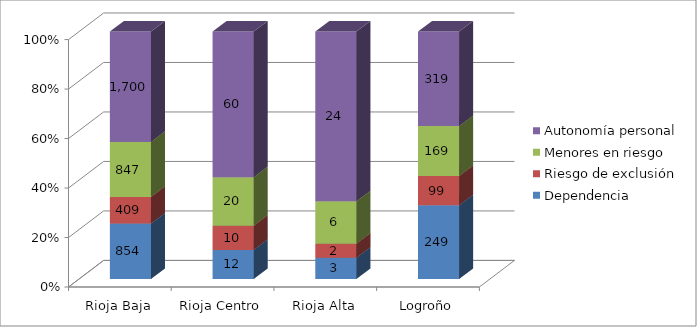
| Category | Dependencia | Riesgo de exclusión | Menores en riesgo | Autonomía personal |
|---|---|---|---|---|
| Rioja Baja | 854 | 409 | 847 | 1700 |
| Rioja Centro | 12 | 10 | 20 | 60 |
| Rioja Alta | 3 | 2 | 6 | 24 |
| Logroño | 249 | 99 | 169 | 319 |